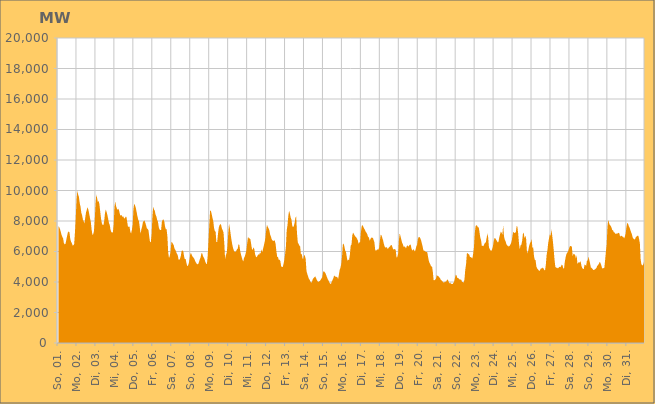
| Category | Series 0 |
|---|---|
|  So, 01.  | 7677.963 |
|  So, 01.  | 7596.943 |
|  So, 01.  | 7473.337 |
|  So, 01.  | 7288.587 |
|  So, 01.  | 7093.69 |
|  So, 01.  | 6961.852 |
|  So, 01.  | 6843.222 |
|  So, 01.  | 6544.108 |
|  So, 01.  | 6469.593 |
|  So, 01.  | 6501.241 |
|  So, 01.  | 6758.023 |
|  So, 01.  | 7020.452 |
|  So, 01.  | 7244.673 |
|  So, 01.  | 7310.799 |
|  So, 01.  | 7248.999 |
|  So, 01.  | 6845.811 |
|  So, 01.  | 6639.702 |
|  Mo, 02.  | 6546.721 |
|  Mo, 02.  | 6400.832 |
|  Mo, 02.  | 6401.919 |
|  Mo, 02.  | 6500.164 |
|  Mo, 02.  | 7293.355 |
|  Mo, 02.  | 8257.685 |
|  Mo, 02.  | 9426.067 |
|  Mo, 02.  | 9984.758 |
|  Mo, 02.  | 9738.788 |
|  Mo, 02.  | 9570.504 |
|  Mo, 02.  | 9179 |
|  Mo, 02.  | 8934.509 |
|  Mo, 02.  | 8547.065 |
|  Mo, 02.  | 8372.927 |
|  Mo, 02.  | 8099.304 |
|  Mo, 02.  | 7981.153 |
|  Mo, 02.  | 7839.546 |
|  Mo, 02.  | 8229.179 |
|  Mo, 02.  | 8569.454 |
|  Mo, 02.  | 8739.026 |
|  Mo, 02.  | 8897.793 |
|  Mo, 02.  | 8731.874 |
|  Mo, 02.  | 8472.272 |
|  Mo, 02.  | 8190.812 |
|  Di, 03.  | 7958.106 |
|  Di, 03.  | 7456.168 |
|  Di, 03.  | 7105.018 |
|  Di, 03.  | 7131.834 |
|  Di, 03.  | 7326.88 |
|  Di, 03.  | 8038.178 |
|  Di, 03.  | 9112.546 |
|  Di, 03.  | 9741.818 |
|  Di, 03.  | 9501.222 |
|  Di, 03.  | 9234.67 |
|  Di, 03.  | 9323.955 |
|  Di, 03.  | 9057.303 |
|  Di, 03.  | 8584.66 |
|  Di, 03.  | 8145.884 |
|  Di, 03.  | 7856.667 |
|  Di, 03.  | 7743.772 |
|  Di, 03.  | 7734.422 |
|  Di, 03.  | 8015.463 |
|  Di, 03.  | 8524.927 |
|  Di, 03.  | 8749.918 |
|  Di, 03.  | 8600.557 |
|  Di, 03.  | 8388.962 |
|  Di, 03.  | 8148.509 |
|  Di, 03.  | 7866.678 |
|  Mi, 04.  | 7740.113 |
|  Mi, 04.  | 7416.906 |
|  Mi, 04.  | 7285.363 |
|  Mi, 04.  | 7224.252 |
|  Mi, 04.  | 7272.472 |
|  Mi, 04.  | 7769.792 |
|  Mi, 04.  | 8924.51 |
|  Mi, 04.  | 9279.618 |
|  Mi, 04.  | 8975.892 |
|  Mi, 04.  | 8819.983 |
|  Mi, 04.  | 8733.511 |
|  Mi, 04.  | 8805.229 |
|  Mi, 04.  | 8658.081 |
|  Mi, 04.  | 8408.276 |
|  Mi, 04.  | 8352.189 |
|  Mi, 04.  | 8393.159 |
|  Mi, 04.  | 8270.952 |
|  Mi, 04.  | 8308.615 |
|  Mi, 04.  | 8195.433 |
|  Mi, 04.  | 8155.768 |
|  Mi, 04.  | 8270.57 |
|  Mi, 04.  | 8284.232 |
|  Mi, 04.  | 7982.198 |
|  Mi, 04.  | 7639.443 |
|  Do, 05.  | 7615.093 |
|  Do, 05.  | 7642.592 |
|  Do, 05.  | 7302.957 |
|  Do, 05.  | 7176.889 |
|  Do, 05.  | 7409.854 |
|  Do, 05.  | 7758.143 |
|  Do, 05.  | 8771.891 |
|  Do, 05.  | 9124.859 |
|  Do, 05.  | 9024.852 |
|  Do, 05.  | 8854.049 |
|  Do, 05.  | 8600.161 |
|  Do, 05.  | 8319.116 |
|  Do, 05.  | 8101.713 |
|  Do, 05.  | 7980.002 |
|  Do, 05.  | 7583.763 |
|  Do, 05.  | 7164.526 |
|  Do, 05.  | 7444.373 |
|  Do, 05.  | 7640.043 |
|  Do, 05.  | 7927.202 |
|  Do, 05.  | 7997.141 |
|  Do, 05.  | 8032.68 |
|  Do, 05.  | 7892.271 |
|  Do, 05.  | 7709.676 |
|  Do, 05.  | 7519.75 |
|  Fr, 06.  | 7472.952 |
|  Fr, 06.  | 7398.035 |
|  Fr, 06.  | 6980.598 |
|  Fr, 06.  | 6609.496 |
|  Fr, 06.  | 6628.196 |
|  Fr, 06.  | 7112.345 |
|  Fr, 06.  | 8260.454 |
|  Fr, 06.  | 8942.975 |
|  Fr, 06.  | 8756.551 |
|  Fr, 06.  | 8674.277 |
|  Fr, 06.  | 8422.794 |
|  Fr, 06.  | 8298.389 |
|  Fr, 06.  | 8081.255 |
|  Fr, 06.  | 7956.173 |
|  Fr, 06.  | 7610.862 |
|  Fr, 06.  | 7438.18 |
|  Fr, 06.  | 7410.077 |
|  Fr, 06.  | 7409.397 |
|  Fr, 06.  | 7948.559 |
|  Fr, 06.  | 8076.779 |
|  Fr, 06.  | 8104.193 |
|  Fr, 06.  | 7979.822 |
|  Fr, 06.  | 7633.091 |
|  Fr, 06.  | 7452.437 |
|  Sa, 07.  | 7453.936 |
|  Sa, 07.  | 6956.596 |
|  Sa, 07.  | 5925.314 |
|  Sa, 07.  | 5574.523 |
|  Sa, 07.  | 5712.954 |
|  Sa, 07.  | 6011.13 |
|  Sa, 07.  | 6611.206 |
|  Sa, 07.  | 6597.226 |
|  Sa, 07.  | 6505.088 |
|  Sa, 07.  | 6409.07 |
|  Sa, 07.  | 6188.875 |
|  Sa, 07.  | 6106.611 |
|  Sa, 07.  | 5979.481 |
|  Sa, 07.  | 5854.716 |
|  Sa, 07.  | 5769.656 |
|  Sa, 07.  | 5490.725 |
|  Sa, 07.  | 5442.818 |
|  Sa, 07.  | 5536.206 |
|  Sa, 07.  | 5714.276 |
|  Sa, 07.  | 6047.285 |
|  Sa, 07.  | 6063.904 |
|  Sa, 07.  | 6023.226 |
|  Sa, 07.  | 5712.043 |
|  Sa, 07.  | 5499.111 |
|  So, 08.  | 5512.843 |
|  So, 08.  | 5260.372 |
|  So, 08.  | 5054.86 |
|  So, 08.  | 5063.326 |
|  So, 08.  | 5217.623 |
|  So, 08.  | 5496.104 |
|  So, 08.  | 5866.787 |
|  So, 08.  | 5881.251 |
|  So, 08.  | 5751.971 |
|  So, 08.  | 5657.296 |
|  So, 08.  | 5606.278 |
|  So, 08.  | 5520.529 |
|  So, 08.  | 5390.364 |
|  So, 08.  | 5285.207 |
|  So, 08.  | 5199.156 |
|  So, 08.  | 5167.306 |
|  So, 08.  | 5175.66 |
|  So, 08.  | 5311.873 |
|  So, 08.  | 5491.855 |
|  So, 08.  | 5616.77 |
|  So, 08.  | 5880.832 |
|  So, 08.  | 5884.841 |
|  So, 08.  | 5698.174 |
|  So, 08.  | 5607.512 |
|  Mo, 09.  | 5492.349 |
|  Mo, 09.  | 5316.035 |
|  Mo, 09.  | 5202.372 |
|  Mo, 09.  | 5185.883 |
|  Mo, 09.  | 5721.586 |
|  Mo, 09.  | 6704.096 |
|  Mo, 09.  | 7732.385 |
|  Mo, 09.  | 8672.376 |
|  Mo, 09.  | 8671.669 |
|  Mo, 09.  | 8471.284 |
|  Mo, 09.  | 8212.902 |
|  Mo, 09.  | 8003.656 |
|  Mo, 09.  | 7553.289 |
|  Mo, 09.  | 7345.442 |
|  Mo, 09.  | 7288.706 |
|  Mo, 09.  | 6624.313 |
|  Mo, 09.  | 6622.512 |
|  Mo, 09.  | 7159.027 |
|  Mo, 09.  | 7560.713 |
|  Mo, 09.  | 7727.444 |
|  Mo, 09.  | 7813.275 |
|  Mo, 09.  | 7728.931 |
|  Mo, 09.  | 7504.664 |
|  Mo, 09.  | 7387.833 |
|  Di, 10.  | 7249.135 |
|  Di, 10.  | 6532.158 |
|  Di, 10.  | 5513.665 |
|  Di, 10.  | 5751.551 |
|  Di, 10.  | 5916.448 |
|  Di, 10.  | 6355.461 |
|  Di, 10.  | 7198.581 |
|  Di, 10.  | 7808.561 |
|  Di, 10.  | 7545.558 |
|  Di, 10.  | 7149.824 |
|  Di, 10.  | 6791.572 |
|  Di, 10.  | 6468.929 |
|  Di, 10.  | 6246.799 |
|  Di, 10.  | 6077.797 |
|  Di, 10.  | 5976.789 |
|  Di, 10.  | 5976.512 |
|  Di, 10.  | 6021.148 |
|  Di, 10.  | 6149.208 |
|  Di, 10.  | 6183.477 |
|  Di, 10.  | 6474.581 |
|  Di, 10.  | 6438.276 |
|  Di, 10.  | 6071.002 |
|  Di, 10.  | 5826.77 |
|  Di, 10.  | 5641.631 |
|  Mi, 11.  | 5458.139 |
|  Mi, 11.  | 5341.87 |
|  Mi, 11.  | 5587.902 |
|  Mi, 11.  | 5687.897 |
|  Mi, 11.  | 5865.069 |
|  Mi, 11.  | 6091.287 |
|  Mi, 11.  | 6562.78 |
|  Mi, 11.  | 6964.531 |
|  Mi, 11.  | 6856.327 |
|  Mi, 11.  | 6866.007 |
|  Mi, 11.  | 6807.743 |
|  Mi, 11.  | 6485.259 |
|  Mi, 11.  | 6172.355 |
|  Mi, 11.  | 6102.992 |
|  Mi, 11.  | 6279.856 |
|  Mi, 11.  | 6155.835 |
|  Mi, 11.  | 5823.545 |
|  Mi, 11.  | 5665.212 |
|  Mi, 11.  | 5611.59 |
|  Mi, 11.  | 5728.001 |
|  Mi, 11.  | 5819.148 |
|  Mi, 11.  | 5766.664 |
|  Mi, 11.  | 5917.108 |
|  Mi, 11.  | 5869.823 |
|  Do, 12.  | 6151.18 |
|  Do, 12.  | 5936.26 |
|  Do, 12.  | 6168.424 |
|  Do, 12.  | 6366.741 |
|  Do, 12.  | 6611.851 |
|  Do, 12.  | 6887.565 |
|  Do, 12.  | 7397.463 |
|  Do, 12.  | 7751.177 |
|  Do, 12.  | 7627.747 |
|  Do, 12.  | 7524.235 |
|  Do, 12.  | 7395.533 |
|  Do, 12.  | 7114.654 |
|  Do, 12.  | 6973.994 |
|  Do, 12.  | 6798.04 |
|  Do, 12.  | 6727.232 |
|  Do, 12.  | 6682.602 |
|  Do, 12.  | 6727.548 |
|  Do, 12.  | 6710.639 |
|  Do, 12.  | 6472.785 |
|  Do, 12.  | 5982.575 |
|  Do, 12.  | 5646.39 |
|  Do, 12.  | 5632.045 |
|  Do, 12.  | 5444.886 |
|  Do, 12.  | 5464.196 |
|  Fr, 13.  | 5349.926 |
|  Fr, 13.  | 5023.988 |
|  Fr, 13.  | 4976.291 |
|  Fr, 13.  | 4991.341 |
|  Fr, 13.  | 5196.389 |
|  Fr, 13.  | 5448.009 |
|  Fr, 13.  | 5835.831 |
|  Fr, 13.  | 6348.496 |
|  Fr, 13.  | 7395.195 |
|  Fr, 13.  | 7731.278 |
|  Fr, 13.  | 8327.441 |
|  Fr, 13.  | 8668.232 |
|  Fr, 13.  | 8498.554 |
|  Fr, 13.  | 8227.319 |
|  Fr, 13.  | 8096.411 |
|  Fr, 13.  | 7691.21 |
|  Fr, 13.  | 7589.889 |
|  Fr, 13.  | 7671.894 |
|  Fr, 13.  | 7872.176 |
|  Fr, 13.  | 8217.893 |
|  Fr, 13.  | 8304.01 |
|  Fr, 13.  | 7207.852 |
|  Fr, 13.  | 6612.196 |
|  Fr, 13.  | 6495.722 |
|  Sa, 14.  | 6388.537 |
|  Sa, 14.  | 6322.059 |
|  Sa, 14.  | 5817.797 |
|  Sa, 14.  | 5851.664 |
|  Sa, 14.  | 5548.277 |
|  Sa, 14.  | 5511.158 |
|  Sa, 14.  | 5765.054 |
|  Sa, 14.  | 5720.817 |
|  Sa, 14.  | 5518.293 |
|  Sa, 14.  | 4728.932 |
|  Sa, 14.  | 4537.753 |
|  Sa, 14.  | 4378.436 |
|  Sa, 14.  | 4223.085 |
|  Sa, 14.  | 4146.438 |
|  Sa, 14.  | 4031.189 |
|  Sa, 14.  | 3944.315 |
|  Sa, 14.  | 4021.367 |
|  Sa, 14.  | 4178.364 |
|  Sa, 14.  | 4267.161 |
|  Sa, 14.  | 4303.962 |
|  Sa, 14.  | 4371.77 |
|  Sa, 14.  | 4277.701 |
|  Sa, 14.  | 4154.936 |
|  Sa, 14.  | 4055.414 |
|  So, 15.  | 3999.173 |
|  So, 15.  | 4049.006 |
|  So, 15.  | 4070.325 |
|  So, 15.  | 4151.397 |
|  So, 15.  | 4236.129 |
|  So, 15.  | 4317.47 |
|  So, 15.  | 4625.944 |
|  So, 15.  | 4719.705 |
|  So, 15.  | 4648.96 |
|  So, 15.  | 4581.006 |
|  So, 15.  | 4450.622 |
|  So, 15.  | 4310.216 |
|  So, 15.  | 4179.253 |
|  So, 15.  | 4092.634 |
|  So, 15.  | 3968.055 |
|  So, 15.  | 3883.651 |
|  So, 15.  | 3876.573 |
|  So, 15.  | 4028.878 |
|  So, 15.  | 4125.574 |
|  So, 15.  | 4246.848 |
|  So, 15.  | 4426.16 |
|  So, 15.  | 4375.766 |
|  So, 15.  | 4344.535 |
|  So, 15.  | 4336.607 |
|  Mo, 16.  | 4319.339 |
|  Mo, 16.  | 4193.091 |
|  Mo, 16.  | 4461.2 |
|  Mo, 16.  | 4785.9 |
|  Mo, 16.  | 4935.553 |
|  Mo, 16.  | 5171.333 |
|  Mo, 16.  | 5662.658 |
|  Mo, 16.  | 6452.184 |
|  Mo, 16.  | 6520.677 |
|  Mo, 16.  | 6327.01 |
|  Mo, 16.  | 6064.089 |
|  Mo, 16.  | 5970.748 |
|  Mo, 16.  | 5651.331 |
|  Mo, 16.  | 5385.936 |
|  Mo, 16.  | 5464.671 |
|  Mo, 16.  | 5460.353 |
|  Mo, 16.  | 5806.388 |
|  Mo, 16.  | 6395.759 |
|  Mo, 16.  | 6442.248 |
|  Mo, 16.  | 7058.747 |
|  Mo, 16.  | 7232.729 |
|  Mo, 16.  | 7157.43 |
|  Mo, 16.  | 7045.354 |
|  Mo, 16.  | 6969.249 |
|  Di, 17.  | 6928.984 |
|  Di, 17.  | 6843.431 |
|  Di, 17.  | 6732.353 |
|  Di, 17.  | 6502.207 |
|  Di, 17.  | 6596.553 |
|  Di, 17.  | 6643.536 |
|  Di, 17.  | 7310.382 |
|  Di, 17.  | 7689.723 |
|  Di, 17.  | 7736.4 |
|  Di, 17.  | 7616.569 |
|  Di, 17.  | 7508.844 |
|  Di, 17.  | 7421.969 |
|  Di, 17.  | 7299.244 |
|  Di, 17.  | 7233.92 |
|  Di, 17.  | 7124.256 |
|  Di, 17.  | 6962.704 |
|  Di, 17.  | 6914.589 |
|  Di, 17.  | 6710.627 |
|  Di, 17.  | 6807.864 |
|  Di, 17.  | 6917.504 |
|  Di, 17.  | 6889.654 |
|  Di, 17.  | 6913.082 |
|  Di, 17.  | 6749.979 |
|  Di, 17.  | 6597.307 |
|  Mi, 18.  | 6104.86 |
|  Mi, 18.  | 6039.58 |
|  Mi, 18.  | 6113.457 |
|  Mi, 18.  | 6136.123 |
|  Mi, 18.  | 6117.518 |
|  Mi, 18.  | 6275.05 |
|  Mi, 18.  | 6759.959 |
|  Mi, 18.  | 7108.7 |
|  Mi, 18.  | 7054.846 |
|  Mi, 18.  | 6889.533 |
|  Mi, 18.  | 6730.013 |
|  Mi, 18.  | 6486.941 |
|  Mi, 18.  | 6318.668 |
|  Mi, 18.  | 6258.571 |
|  Mi, 18.  | 6277.261 |
|  Mi, 18.  | 6262.314 |
|  Mi, 18.  | 6161.16 |
|  Mi, 18.  | 6244.067 |
|  Mi, 18.  | 6290.051 |
|  Mi, 18.  | 6349.723 |
|  Mi, 18.  | 6436.463 |
|  Mi, 18.  | 6403.457 |
|  Mi, 18.  | 6247.967 |
|  Mi, 18.  | 6130.759 |
|  Do, 19.  | 6144.409 |
|  Do, 19.  | 6172.107 |
|  Do, 19.  | 6091.047 |
|  Do, 19.  | 5598.2 |
|  Do, 19.  | 5641.099 |
|  Do, 19.  | 5853.128 |
|  Do, 19.  | 6741.91 |
|  Do, 19.  | 7184.799 |
|  Do, 19.  | 7013.304 |
|  Do, 19.  | 6802.295 |
|  Do, 19.  | 6583.252 |
|  Do, 19.  | 6481.809 |
|  Do, 19.  | 6304.773 |
|  Do, 19.  | 6336.934 |
|  Do, 19.  | 6291.648 |
|  Do, 19.  | 6201.757 |
|  Do, 19.  | 6363.796 |
|  Do, 19.  | 6398.977 |
|  Do, 19.  | 6316.845 |
|  Do, 19.  | 6393.516 |
|  Do, 19.  | 6453.675 |
|  Do, 19.  | 6444.471 |
|  Do, 19.  | 6171.66 |
|  Do, 19.  | 6061.212 |
|  Fr, 20.  | 6124.029 |
|  Fr, 20.  | 6132.836 |
|  Fr, 20.  | 5997.881 |
|  Fr, 20.  | 6105.003 |
|  Fr, 20.  | 6327.442 |
|  Fr, 20.  | 6439.427 |
|  Fr, 20.  | 6801.615 |
|  Fr, 20.  | 6942.363 |
|  Fr, 20.  | 6959.252 |
|  Fr, 20.  | 6880.221 |
|  Fr, 20.  | 6738.648 |
|  Fr, 20.  | 6549.957 |
|  Fr, 20.  | 6340.777 |
|  Fr, 20.  | 6080.57 |
|  Fr, 20.  | 6047.577 |
|  Fr, 20.  | 6036.424 |
|  Fr, 20.  | 5964.52 |
|  Fr, 20.  | 5976.441 |
|  Fr, 20.  | 5934.138 |
|  Fr, 20.  | 5627.831 |
|  Fr, 20.  | 5360.258 |
|  Fr, 20.  | 5230.376 |
|  Fr, 20.  | 5123.633 |
|  Fr, 20.  | 5008.77 |
|  Sa, 21.  | 5012.272 |
|  Sa, 21.  | 4635.648 |
|  Sa, 21.  | 4103.151 |
|  Sa, 21.  | 4116.81 |
|  Sa, 21.  | 4151.054 |
|  Sa, 21.  | 4228.813 |
|  Sa, 21.  | 4469.313 |
|  Sa, 21.  | 4389.478 |
|  Sa, 21.  | 4384.793 |
|  Sa, 21.  | 4315.07 |
|  Sa, 21.  | 4260.019 |
|  Sa, 21.  | 4142.587 |
|  Sa, 21.  | 4102.314 |
|  Sa, 21.  | 4049.059 |
|  Sa, 21.  | 3985.424 |
|  Sa, 21.  | 3956.727 |
|  Sa, 21.  | 4011.24 |
|  Sa, 21.  | 4019.13 |
|  Sa, 21.  | 4043.206 |
|  Sa, 21.  | 4157.403 |
|  Sa, 21.  | 4150.122 |
|  Sa, 21.  | 4015.634 |
|  Sa, 21.  | 3900.767 |
|  Sa, 21.  | 3971.927 |
|  So, 22.  | 3867.761 |
|  So, 22.  | 3881.558 |
|  So, 22.  | 3867.811 |
|  So, 22.  | 3937.732 |
|  So, 22.  | 4049.514 |
|  So, 22.  | 4269.664 |
|  So, 22.  | 4479.989 |
|  So, 22.  | 4428.858 |
|  So, 22.  | 4254.746 |
|  So, 22.  | 4262.306 |
|  So, 22.  | 4207.19 |
|  So, 22.  | 4165.712 |
|  So, 22.  | 4161.314 |
|  So, 22.  | 4140.428 |
|  So, 22.  | 3998.908 |
|  So, 22.  | 3995.986 |
|  So, 22.  | 3956.933 |
|  So, 22.  | 4170.997 |
|  So, 22.  | 4810.987 |
|  So, 22.  | 5154.909 |
|  So, 22.  | 5852.73 |
|  So, 22.  | 5900.99 |
|  So, 22.  | 5833.369 |
|  So, 22.  | 5797.584 |
|  Mo, 23.  | 5625.465 |
|  Mo, 23.  | 5637.414 |
|  Mo, 23.  | 5588.611 |
|  Mo, 23.  | 5554.442 |
|  Mo, 23.  | 5842.557 |
|  Mo, 23.  | 6277.153 |
|  Mo, 23.  | 7170.738 |
|  Mo, 23.  | 7648.134 |
|  Mo, 23.  | 7729.234 |
|  Mo, 23.  | 7689.098 |
|  Mo, 23.  | 7577.904 |
|  Mo, 23.  | 7591.42 |
|  Mo, 23.  | 7279.726 |
|  Mo, 23.  | 6919.595 |
|  Mo, 23.  | 6737.636 |
|  Mo, 23.  | 6356.071 |
|  Mo, 23.  | 6379.774 |
|  Mo, 23.  | 6343.498 |
|  Mo, 23.  | 6483.221 |
|  Mo, 23.  | 6564.757 |
|  Mo, 23.  | 6589.252 |
|  Mo, 23.  | 6876.402 |
|  Mo, 23.  | 7192.895 |
|  Mo, 23.  | 6911.87 |
|  Di, 24.  | 6266.941 |
|  Di, 24.  | 6155.711 |
|  Di, 24.  | 6071.498 |
|  Di, 24.  | 6043.891 |
|  Di, 24.  | 6150.772 |
|  Di, 24.  | 6333.323 |
|  Di, 24.  | 6665.823 |
|  Di, 24.  | 6887.325 |
|  Di, 24.  | 6865.318 |
|  Di, 24.  | 6783.427 |
|  Di, 24.  | 6687.035 |
|  Di, 24.  | 6600.932 |
|  Di, 24.  | 6618.496 |
|  Di, 24.  | 6916.322 |
|  Di, 24.  | 7118.299 |
|  Di, 24.  | 7298.052 |
|  Di, 24.  | 7235.647 |
|  Di, 24.  | 7113.544 |
|  Di, 24.  | 7709.892 |
|  Di, 24.  | 7009.711 |
|  Di, 24.  | 6774.748 |
|  Di, 24.  | 6675.779 |
|  Di, 24.  | 6494.079 |
|  Di, 24.  | 6383.602 |
|  Mi, 25.  | 6386.226 |
|  Mi, 25.  | 6322.608 |
|  Mi, 25.  | 6359.883 |
|  Mi, 25.  | 6448.667 |
|  Mi, 25.  | 6540.717 |
|  Mi, 25.  | 6748.986 |
|  Mi, 25.  | 7105.753 |
|  Mi, 25.  | 7304.376 |
|  Mi, 25.  | 7213.86 |
|  Mi, 25.  | 7227.58 |
|  Mi, 25.  | 7273.441 |
|  Mi, 25.  | 7663.707 |
|  Mi, 25.  | 7616.331 |
|  Mi, 25.  | 7169.007 |
|  Mi, 25.  | 6531.481 |
|  Mi, 25.  | 6142.992 |
|  Mi, 25.  | 6400.297 |
|  Mi, 25.  | 6448.178 |
|  Mi, 25.  | 6690.641 |
|  Mi, 25.  | 7173.835 |
|  Mi, 25.  | 7233.213 |
|  Mi, 25.  | 6862.107 |
|  Mi, 25.  | 7039.588 |
|  Mi, 25.  | 6853.291 |
|  Do, 26.  | 6058.579 |
|  Do, 26.  | 5879.308 |
|  Do, 26.  | 6139.264 |
|  Do, 26.  | 6406.074 |
|  Do, 26.  | 6550.87 |
|  Do, 26.  | 6652.044 |
|  Do, 26.  | 6799.168 |
|  Do, 26.  | 6248.51 |
|  Do, 26.  | 6267.899 |
|  Do, 26.  | 5694.771 |
|  Do, 26.  | 5451.194 |
|  Do, 26.  | 5438.278 |
|  Do, 26.  | 5019.198 |
|  Do, 26.  | 4889.543 |
|  Do, 26.  | 4828.301 |
|  Do, 26.  | 4756.473 |
|  Do, 26.  | 4722.31 |
|  Do, 26.  | 4818.254 |
|  Do, 26.  | 4912.023 |
|  Do, 26.  | 4874.856 |
|  Do, 26.  | 4950.973 |
|  Do, 26.  | 4896.322 |
|  Do, 26.  | 4782.398 |
|  Do, 26.  | 4766.307 |
|  Fr, 27.  | 5143.365 |
|  Fr, 27.  | 5783.566 |
|  Fr, 27.  | 6086.495 |
|  Fr, 27.  | 6557.78 |
|  Fr, 27.  | 6858.135 |
|  Fr, 27.  | 7128.223 |
|  Fr, 27.  | 7029.474 |
|  Fr, 27.  | 7438.982 |
|  Fr, 27.  | 7080.828 |
|  Fr, 27.  | 6617.021 |
|  Fr, 27.  | 6076.817 |
|  Fr, 27.  | 5453.278 |
|  Fr, 27.  | 5003.526 |
|  Fr, 27.  | 4931.93 |
|  Fr, 27.  | 4948.207 |
|  Fr, 27.  | 4889.996 |
|  Fr, 27.  | 4917.435 |
|  Fr, 27.  | 5006.451 |
|  Fr, 27.  | 4967.532 |
|  Fr, 27.  | 5015.058 |
|  Fr, 27.  | 5130.318 |
|  Fr, 27.  | 5109.324 |
|  Fr, 27.  | 4903.151 |
|  Fr, 27.  | 4881.4 |
|  Sa, 28.  | 5325.851 |
|  Sa, 28.  | 5607.427 |
|  Sa, 28.  | 5831.245 |
|  Sa, 28.  | 5924.224 |
|  Sa, 28.  | 5983.608 |
|  Sa, 28.  | 6131.734 |
|  Sa, 28.  | 6302.17 |
|  Sa, 28.  | 6361.32 |
|  Sa, 28.  | 6365.221 |
|  Sa, 28.  | 6275.85 |
|  Sa, 28.  | 5672.464 |
|  Sa, 28.  | 5867.993 |
|  Sa, 28.  | 5817.557 |
|  Sa, 28.  | 5781.579 |
|  Sa, 28.  | 5559.836 |
|  Sa, 28.  | 5751.001 |
|  Sa, 28.  | 5183.735 |
|  Sa, 28.  | 5266.213 |
|  Sa, 28.  | 5302.846 |
|  Sa, 28.  | 5276.15 |
|  Sa, 28.  | 5369.028 |
|  Sa, 28.  | 5068.015 |
|  Sa, 28.  | 4926.83 |
|  Sa, 28.  | 4859.789 |
|  So, 29.  | 4853.547 |
|  So, 29.  | 5149.546 |
|  So, 29.  | 5109.292 |
|  So, 29.  | 5069.458 |
|  So, 29.  | 5391.486 |
|  So, 29.  | 5416.289 |
|  So, 29.  | 5673.113 |
|  So, 29.  | 5432.211 |
|  So, 29.  | 5213.143 |
|  So, 29.  | 4946.991 |
|  So, 29.  | 4925.902 |
|  So, 29.  | 4861.373 |
|  So, 29.  | 4787.32 |
|  So, 29.  | 4777.287 |
|  So, 29.  | 4831.999 |
|  So, 29.  | 4860.89 |
|  So, 29.  | 4921.519 |
|  So, 29.  | 5056.35 |
|  So, 29.  | 5111.499 |
|  So, 29.  | 5180.307 |
|  So, 29.  | 5308.467 |
|  So, 29.  | 5258.233 |
|  So, 29.  | 5118.861 |
|  So, 29.  | 4935.008 |
|  Mo, 30.  | 4874.756 |
|  Mo, 30.  | 4916.962 |
|  Mo, 30.  | 4917.156 |
|  Mo, 30.  | 5425.739 |
|  Mo, 30.  | 5979.031 |
|  Mo, 30.  | 6460.843 |
|  Mo, 30.  | 7611.603 |
|  Mo, 30.  | 8088.481 |
|  Mo, 30.  | 7861.53 |
|  Mo, 30.  | 7742.452 |
|  Mo, 30.  | 7691.584 |
|  Mo, 30.  | 7590.641 |
|  Mo, 30.  | 7409.539 |
|  Mo, 30.  | 7389.08 |
|  Mo, 30.  | 7270.151 |
|  Mo, 30.  | 7244.884 |
|  Mo, 30.  | 7160.338 |
|  Mo, 30.  | 7174.265 |
|  Mo, 30.  | 7170.118 |
|  Mo, 30.  | 7190.291 |
|  Mo, 30.  | 7226.908 |
|  Mo, 30.  | 7191.77 |
|  Mo, 30.  | 6970.516 |
|  Mo, 30.  | 7034.959 |
|  Di, 31.  | 7022.63 |
|  Di, 31.  | 6975.177 |
|  Di, 31.  | 6959.019 |
|  Di, 31.  | 6866.935 |
|  Di, 31.  | 6970.276 |
|  Di, 31.  | 7175.807 |
|  Di, 31.  | 7577.463 |
|  Di, 31.  | 7879.523 |
|  Di, 31.  | 7826.275 |
|  Di, 31.  | 7660.22 |
|  Di, 31.  | 7570.255 |
|  Di, 31.  | 7398.106 |
|  Di, 31.  | 7254.383 |
|  Di, 31.  | 7112.276 |
|  Di, 31.  | 6907.682 |
|  Di, 31.  | 6833.927 |
|  Di, 31.  | 6785.874 |
|  Di, 31.  | 6815.955 |
|  Di, 31.  | 6961.012 |
|  Di, 31.  | 6979.246 |
|  Di, 31.  | 7039.54 |
|  Di, 31.  | 7036.531 |
|  Di, 31.  | 6823.491 |
|  Di, 31.  | 6531.621 |
|  Mi, 01.  | 5478.593 |
|  Mi, 01.  | 5152.866 |
|  Mi, 01.  | 5098.307 |
|  Mi, 01.  | 5104.745 |
|  Mi, 01.  | 5275.345 |
|  Mi, 01.  | 5444.629 |